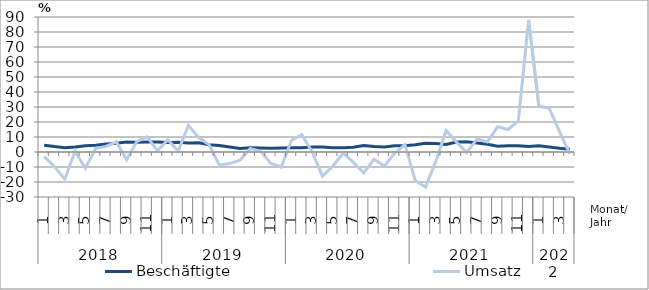
| Category | Beschäftigte | Umsatz |
|---|---|---|
| 0 | 4.5 | -3 |
| 1 | 3.6 | -9.8 |
| 2 | 2.9 | -18.1 |
| 3 | 3.4 | 0.5 |
| 4 | 4.2 | -11 |
| 5 | 4.5 | 2.5 |
| 6 | 5.3 | 3.7 |
| 7 | 5.8 | 6.8 |
| 8 | 6.6 | -5.2 |
| 9 | 6.5 | 7.1 |
| 10 | 6.6 | 10.1 |
| 11 | 6.6 | 0.8 |
| 12 | 6.4 | 8.2 |
| 13 | 6.5 | 0.6 |
| 14 | 6 | 17.8 |
| 15 | 6.1 | 9.6 |
| 16 | 4.9 | 4.9 |
| 17 | 4.3 | -8.8 |
| 18 | 3.3 | -7.7 |
| 19 | 2.4 | -5.4 |
| 20 | 2.8 | 2.4 |
| 21 | 2.7 | 0.5 |
| 22 | 2.5 | -7.6 |
| 23 | 2.7 | -10 |
| 24 | 2.9 | 7.8 |
| 25 | 2.9 | 11.5 |
| 26 | 3.4 | 0.1 |
| 27 | 3.4 | -16.1 |
| 28 | 2.9 | -9.5 |
| 29 | 2.9 | -0.8 |
| 30 | 3.1 | -6.9 |
| 31 | 4.3 | -14 |
| 32 | 3.6 | -4.9 |
| 33 | 3.4 | -9.4 |
| 34 | 4.1 | -0.9 |
| 35 | 4.1 | 4.9 |
| 36 | 4.8 | -19.1 |
| 37 | 5.8 | -23.3 |
| 38 | 5.6 | -6.1 |
| 39 | 5 | 14.4 |
| 40 | 6.6 | 6.6 |
| 41 | 6.9 | -0.3 |
| 42 | 6 | 8.7 |
| 43 | 5.2 | 6.7 |
| 44 | 3.8 | 16.9 |
| 45 | 4.2 | 15 |
| 46 | 4.2 | 20.6 |
| 47 | 3.7 | 88.1 |
| 48 | 4.2 | 30.5 |
| 49 | 3.4 | 29.2 |
| 50 | 2.5 | 13.5 |
| 51 | 1.8 | -1.2 |